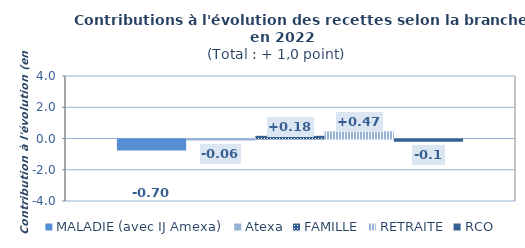
| Category | MALADIE (avec IJ Amexa) | Atexa | FAMILLE | RETRAITE | RCO |
|---|---|---|---|---|---|
| Contri croiss | -0.705 | -0.064 | 0.178 | 0.468 | -0.147 |